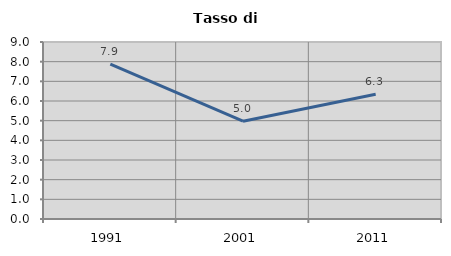
| Category | Tasso di disoccupazione   |
|---|---|
| 1991.0 | 7.878 |
| 2001.0 | 4.971 |
| 2011.0 | 6.341 |